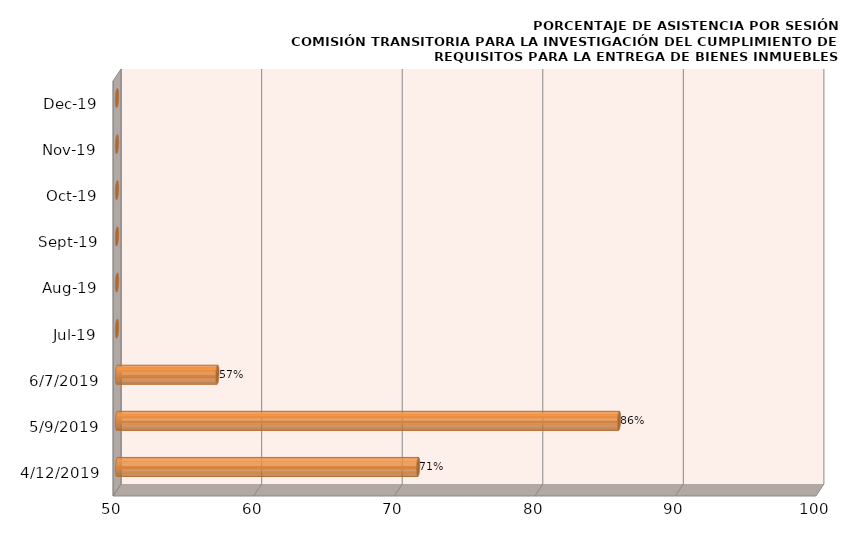
| Category | Series 0 |
|---|---|
| 4/12/19 | 71.429 |
| 5/9/19 | 85.714 |
| 6/7/19 | 57.143 |
| 7/1/19 | 0 |
| 8/1/19 | 0 |
| 9/1/19 | 0 |
| 10/1/19 | 0 |
| 11/1/19 | 0 |
| 12/1/19 | 0 |